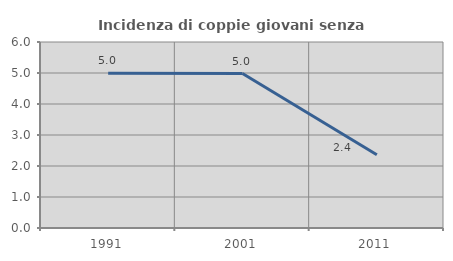
| Category | Incidenza di coppie giovani senza figli |
|---|---|
| 1991.0 | 4.994 |
| 2001.0 | 4.984 |
| 2011.0 | 2.366 |